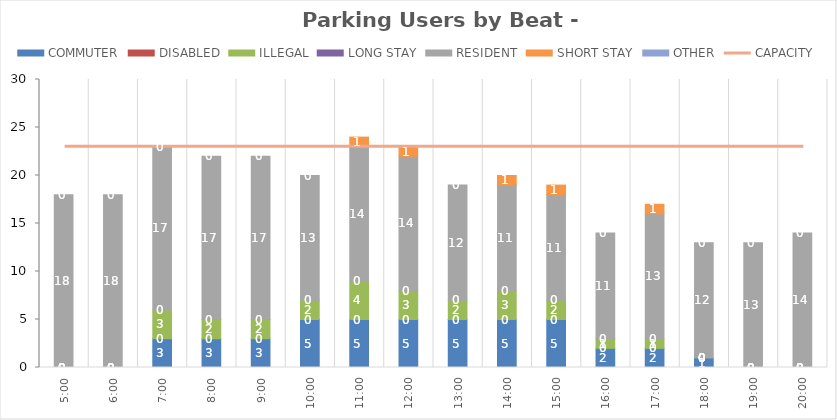
| Category | COMMUTER | DISABLED | ILLEGAL | LONG STAY | RESIDENT | SHORT STAY | OTHER |
|---|---|---|---|---|---|---|---|
| 0.20833333333333334 | 0 | 0 | 0 | 0 | 18 | 0 | 0 |
| 0.25 | 0 | 0 | 0 | 0 | 18 | 0 | 0 |
| 0.2916666666666667 | 3 | 0 | 3 | 0 | 17 | 0 | 0 |
| 0.3333333333333333 | 3 | 0 | 2 | 0 | 17 | 0 | 0 |
| 0.375 | 3 | 0 | 2 | 0 | 17 | 0 | 0 |
| 0.4166666666666667 | 5 | 0 | 2 | 0 | 13 | 0 | 0 |
| 0.4583333333333333 | 5 | 0 | 4 | 0 | 14 | 1 | 0 |
| 0.5 | 5 | 0 | 3 | 0 | 14 | 1 | 0 |
| 0.5416666666666666 | 5 | 0 | 2 | 0 | 12 | 0 | 0 |
| 0.5833333333333334 | 5 | 0 | 3 | 0 | 11 | 1 | 0 |
| 0.625 | 5 | 0 | 2 | 0 | 11 | 1 | 0 |
| 0.6666666666666666 | 2 | 0 | 1 | 0 | 11 | 0 | 0 |
| 0.7083333333333334 | 2 | 0 | 1 | 0 | 13 | 1 | 0 |
| 0.75 | 1 | 0 | 0 | 0 | 12 | 0 | 0 |
| 0.7916666666666666 | 0 | 0 | 0 | 0 | 13 | 0 | 0 |
| 0.8333333333333334 | 0 | 0 | 0 | 0 | 14 | 0 | 0 |